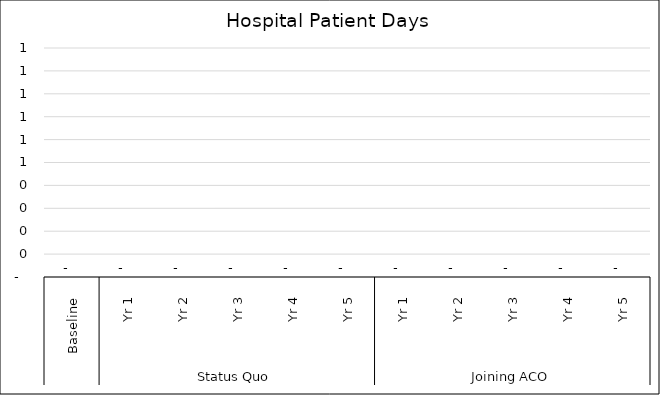
| Category | Hospital Patient Days |
|---|---|
| 0 | 0 |
| 1 | 0 |
| 2 | 0 |
| 3 | 0 |
| 4 | 0 |
| 5 | 0 |
| 6 | 0 |
| 7 | 0 |
| 8 | 0 |
| 9 | 0 |
| 10 | 0 |